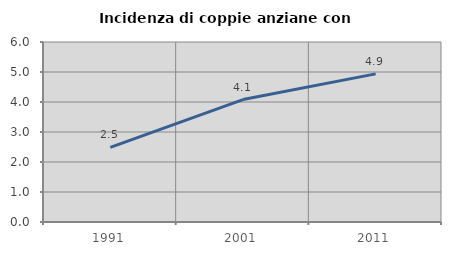
| Category | Incidenza di coppie anziane con figli |
|---|---|
| 1991.0 | 2.487 |
| 2001.0 | 4.082 |
| 2011.0 | 4.938 |